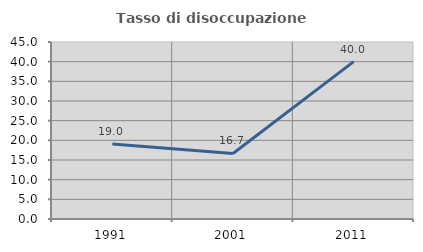
| Category | Tasso di disoccupazione giovanile  |
|---|---|
| 1991.0 | 19.048 |
| 2001.0 | 16.667 |
| 2011.0 | 40 |